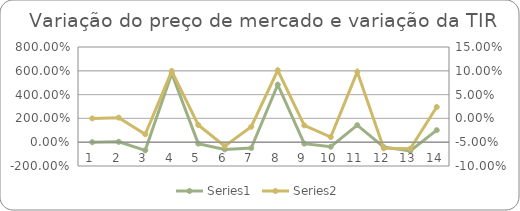
| Category | Series 0 |
|---|---|
| 0 | 0 |
| 1 | 0.032 |
| 2 | -0.684 |
| 3 | 5.77 |
| 4 | -0.118 |
| 5 | -0.604 |
| 6 | -0.49 |
| 7 | 4.827 |
| 8 | -0.121 |
| 9 | -0.379 |
| 10 | 1.434 |
| 11 | -0.411 |
| 12 | -0.731 |
| 13 | 1.012 |